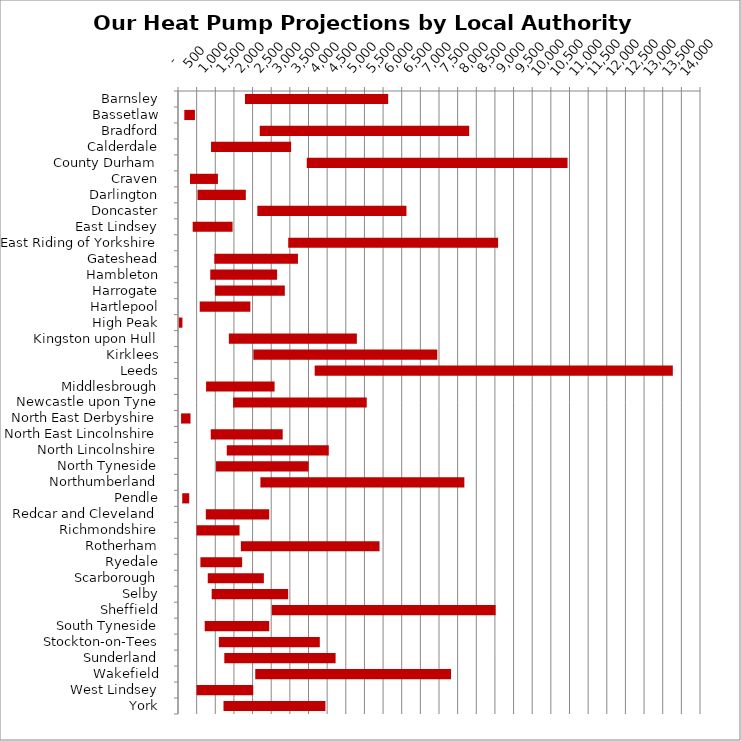
| Category | MIN | MAX |
|---|---|---|
| Barnsley | 1796 | 3841 |
| Bassetlaw | 169 | 285 |
| Bradford | 2192 | 5617 |
| Calderdale | 886 | 2148 |
| County Durham | 3453 | 6995 |
| Craven | 321 | 750 |
| Darlington | 524 | 1295 |
| Doncaster | 2128 | 3999 |
| East Lindsey | 394 | 1069 |
| East Riding of Yorkshire | 2956 | 5629 |
| Gateshead | 974 | 2243 |
| Hambleton | 865 | 1793 |
| Harrogate | 992 | 1873 |
| Hartlepool | 582 | 1359 |
| High Peak | 21 | 98 |
| Kingston upon Hull | 1364 | 3433 |
| Kirklees | 2021 | 4933 |
| Leeds | 3666 | 9605 |
| Middlesbrough | 753 | 1838 |
| Newcastle upon Tyne | 1477 | 3585 |
| North East Derbyshire | 82 | 254 |
| North East Lincolnshire | 878 | 1930 |
| North Lincolnshire | 1308 | 2736 |
| North Tyneside | 1020 | 2482 |
| Northumberland | 2210 | 5470 |
| Pendle | 113 | 188 |
| Redcar and Cleveland | 746 | 1700 |
| Richmondshire | 498 | 1153 |
| Rotherham | 1686 | 3719 |
| Ryedale | 601 | 1119 |
| Scarborough | 798 | 1505 |
| Selby | 903 | 2052 |
| Sheffield | 2516 | 6003 |
| South Tyneside | 716 | 1730 |
| Stockton-on-Tees | 1096 | 2707 |
| Sunderland | 1242 | 2985 |
| Wakefield | 2072 | 5251 |
| West Lindsey | 499 | 1518 |
| York | 1220 | 2734 |